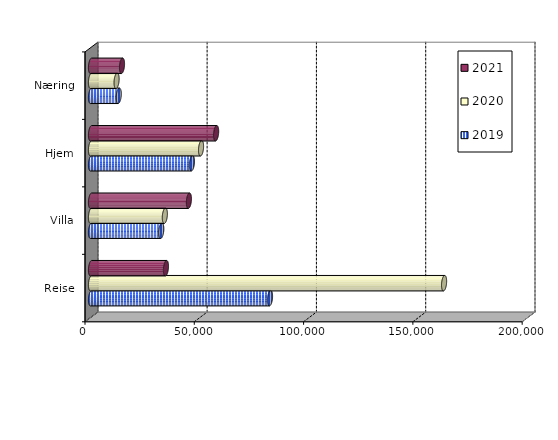
| Category | 2019 | 2020 | 2021 |
|---|---|---|---|
| Reise | 81899 | 161525 | 34290.494 |
| Villa | 32150.91 | 33779.379 | 44786.945 |
| Hjem | 46176.704 | 50338.84 | 57244.673 |
| Næring | 12689.964 | 11707.421 | 14184.868 |